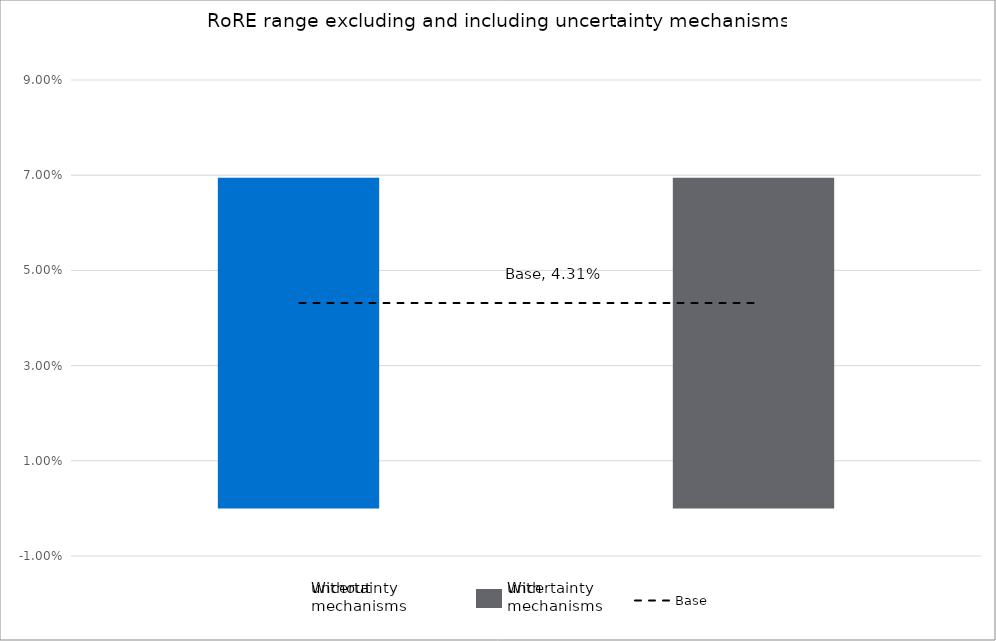
| Category | Low case | High case |
|---|---|---|
| Without uncertainty | -0.016 | 0.069 |
| Without uncertainty | -0.016 | 0.069 |